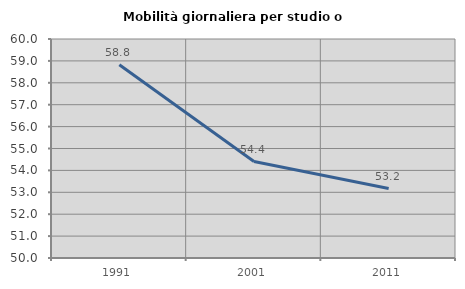
| Category | Mobilità giornaliera per studio o lavoro |
|---|---|
| 1991.0 | 58.828 |
| 2001.0 | 54.403 |
| 2011.0 | 53.17 |